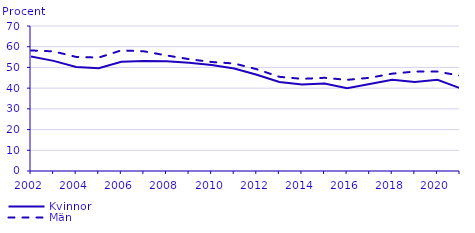
| Category | Kvinnor | Män |
|---|---|---|
| 2002.0 | 55.326 | 58.186 |
| 2003.0 | 53.17 | 57.758 |
| 2004.0 | 50.207 | 55.064 |
| 2005.0 | 49.629 | 54.759 |
| 2006.0 | 52.687 | 58.225 |
| 2007.0 | 53.163 | 57.779 |
| 2008.0 | 53.002 | 55.787 |
| 2009.0 | 52.267 | 53.994 |
| 2010.0 | 51.126 | 52.615 |
| 2011.0 | 49.444 | 51.908 |
| 2012.0 | 46.442 | 49.139 |
| 2013.0 | 42.982 | 45.47 |
| 2014.0 | 41.785 | 44.488 |
| 2015.0 | 42.268 | 44.996 |
| 2016.0 | 40 | 44 |
| 2017.0 | 42 | 45 |
| 2018.0 | 44 | 47 |
| 2019.0 | 43 | 48 |
| 2020.0 | 44 | 48 |
| 2021.0 | 40 | 46 |